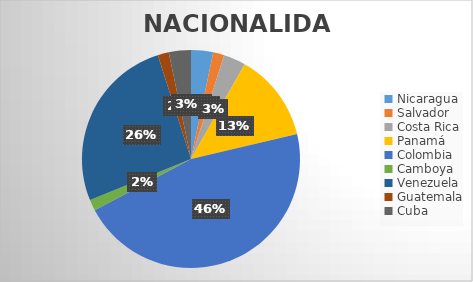
| Category | Series 0 |
|---|---|
| Nicaragua  | 2 |
| Salvador | 1 |
| Costa Rica | 2 |
| Panamá  | 8 |
| Colombia | 28 |
| Camboya  | 1 |
| Venezuela | 16 |
| Guatemala | 1 |
| Cuba | 2 |